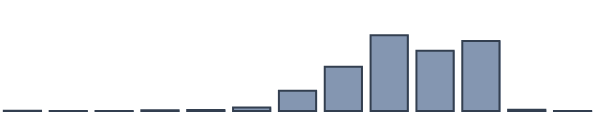
| Category | Series 0 |
|---|---|
| 0 | 0.087 |
| 1 | 0.043 |
| 2 | 0.043 |
| 3 | 0.261 |
| 4 | 0.348 |
| 5 | 1.304 |
| 6 | 7.261 |
| 7 | 15.913 |
| 8 | 27.304 |
| 9 | 21.739 |
| 10 | 25.217 |
| 11 | 0.435 |
| 12 | 0.043 |